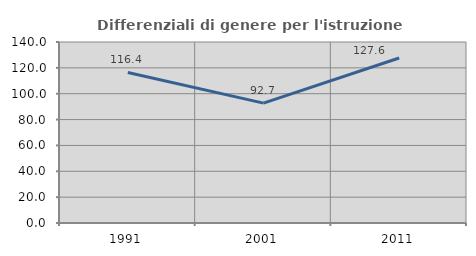
| Category | Differenziali di genere per l'istruzione superiore |
|---|---|
| 1991.0 | 116.444 |
| 2001.0 | 92.727 |
| 2011.0 | 127.634 |